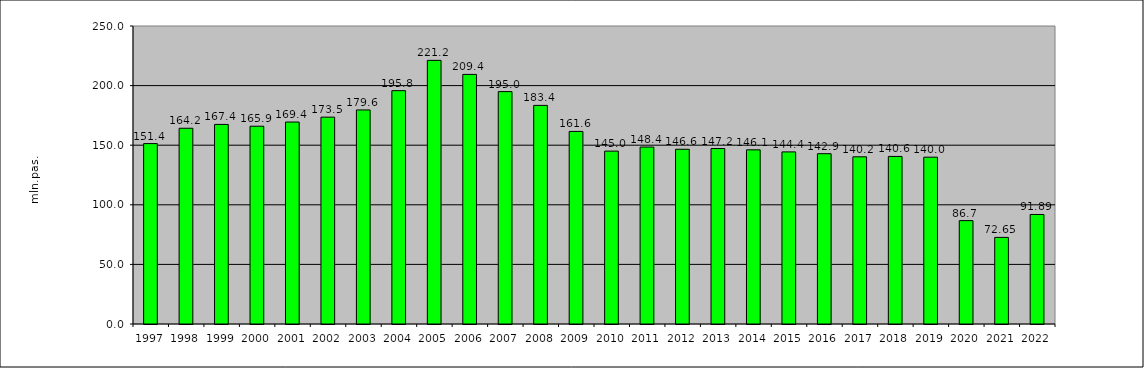
| Category | passengers transported (mill pas.) |
|---|---|
| 1997.0 | 151.353 |
| 1998.0 | 164.213 |
| 1999.0 | 167.439 |
| 2000.0 | 165.917 |
| 2001.0 | 169.429 |
| 2002.0 | 173.532 |
| 2003.0 | 179.572 |
| 2004.0 | 195.756 |
| 2005.0 | 221.168 |
| 2006.0 | 209.381 |
| 2007.0 | 194.955 |
| 2008.0 | 183.39 |
| 2009.0 | 161.559 |
| 2010.0 | 145.021 |
| 2011.0 | 148.448 |
| 2012.0 | 146.587 |
| 2013.0 | 147.216 |
| 2014.0 | 146.114 |
| 2015.0 | 144.374 |
| 2016.0 | 142.871 |
| 2017.0 | 140.249 |
| 2018.0 | 140.583 |
| 2019.0 | 139.955 |
| 2020.0 | 86.725 |
| 2021.0 | 72.65 |
| 2022.0 | 91.886 |